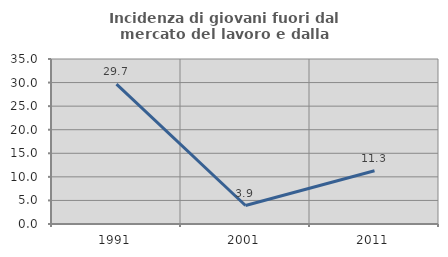
| Category | Incidenza di giovani fuori dal mercato del lavoro e dalla formazione  |
|---|---|
| 1991.0 | 29.688 |
| 2001.0 | 3.922 |
| 2011.0 | 11.29 |